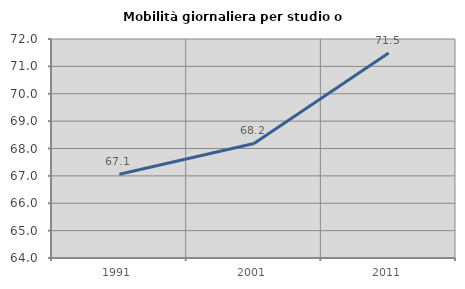
| Category | Mobilità giornaliera per studio o lavoro |
|---|---|
| 1991.0 | 67.057 |
| 2001.0 | 68.184 |
| 2011.0 | 71.485 |